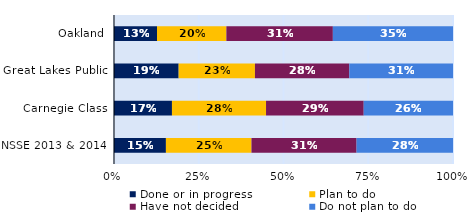
| Category | Done or in progress | Plan to do | Have not decided | Do not plan to do |
|---|---|---|---|---|
| Oakland | 0.127 | 0.205 | 0.314 | 0.354 |
| Great Lakes Public | 0.191 | 0.225 | 0.278 | 0.306 |
| Carnegie Class | 0.171 | 0.278 | 0.288 | 0.263 |
| NSSE 2013 & 2014 | 0.153 | 0.252 | 0.31 | 0.284 |